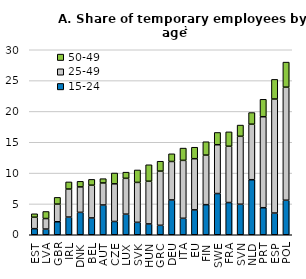
| Category | 15-24 | 25-49 | 50-49 |
|---|---|---|---|
| EST | 0.99 | 1.854 | 0.558 |
| LVA | 0.92 | 1.709 | 1.144 |
| GBR | 2.106 | 2.866 | 1.091 |
| IRL | 2.868 | 4.546 | 1.154 |
| DNK | 3.632 | 4.131 | 0.902 |
| BEL | 2.727 | 5.312 | 0.941 |
| AUT | 4.827 | 3.574 | 0.695 |
| CZE | 2.155 | 6.107 | 1.75 |
| LUX | 3.341 | 5.813 | 0.998 |
| SVK | 2.016 | 6.474 | 2.016 |
| HUN | 1.755 | 6.924 | 2.672 |
| GRC | 1.531 | 8.791 | 1.6 |
| DEU | 5.643 | 6.239 | 1.247 |
| ITA | 2.669 | 9.394 | 1.991 |
| EU | 4.035 | 8.299 | 1.86 |
| FIN | 4.881 | 8.035 | 2.169 |
| SWE | 6.686 | 7.911 | 1.991 |
| FRA | 5.226 | 9.125 | 2.335 |
| SVN | 4.951 | 11.015 | 1.821 |
| NLD | 8.924 | 9.004 | 1.886 |
| PRT | 4.384 | 14.754 | 2.829 |
| ESP | 3.521 | 18.492 | 3.183 |
| POL | 5.599 | 18.333 | 4.066 |